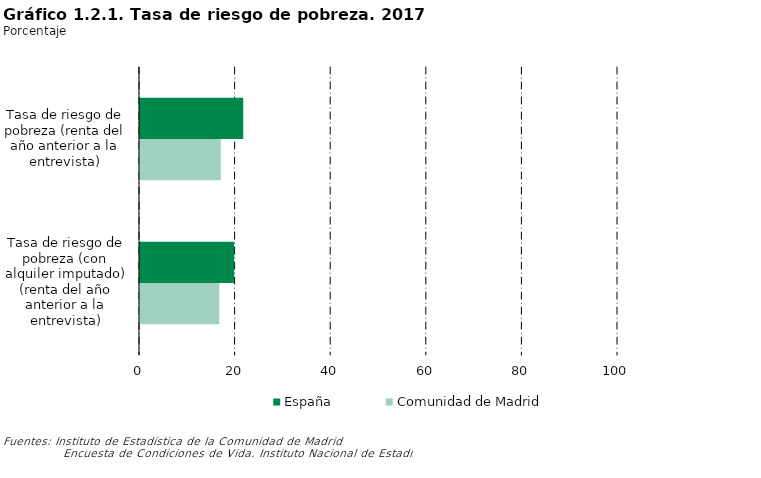
| Category | España | Comunidad de Madrid |
|---|---|---|
| Tasa de riesgo de pobreza (renta del año anterior a la entrevista) | 21.6 | 16.9 |
| Tasa de riesgo de pobreza (con alquiler imputado) (renta del año anterior a la entrevista) | 19.7 | 16.6 |